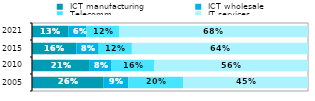
| Category |  ICT manufacturing |  ICT wholesale |  Telecomm. |  IT services |
|---|---|---|---|---|
| 2005.0 | 0.258 | 0.09 | 0.199 | 0.453 |
| 2010.0 | 0.209 | 0.079 | 0.156 | 0.556 |
| 2015.0 | 0.161 | 0.08 | 0.12 | 0.638 |
| 2021.0 | 0.133 | 0.064 | 0.118 | 0.685 |